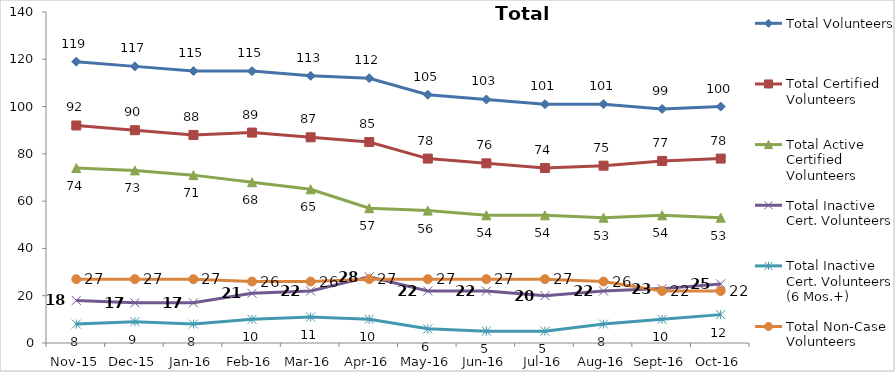
| Category | Total Volunteers | Total Certified Volunteers | Total Active Certified Volunteers | Total Inactive Cert. Volunteers | Total Inactive Cert. Volunteers (6 Mos.+) | Total Non-Case Volunteers |
|---|---|---|---|---|---|---|
| Nov-15 | 119 | 92 | 74 | 18 | 8 | 27 |
| Dec-15 | 117 | 90 | 73 | 17 | 9 | 27 |
| Jan-16 | 115 | 88 | 71 | 17 | 8 | 27 |
| Feb-16 | 115 | 89 | 68 | 21 | 10 | 26 |
| Mar-16 | 113 | 87 | 65 | 22 | 11 | 26 |
| Apr-16 | 112 | 85 | 57 | 28 | 10 | 27 |
| May-16 | 105 | 78 | 56 | 22 | 6 | 27 |
| Jun-16 | 103 | 76 | 54 | 22 | 5 | 27 |
| Jul-16 | 101 | 74 | 54 | 20 | 5 | 27 |
| Aug-16 | 101 | 75 | 53 | 22 | 8 | 26 |
| Sep-16 | 99 | 77 | 54 | 23 | 10 | 22 |
| Oct-16 | 100 | 78 | 53 | 25 | 12 | 22 |